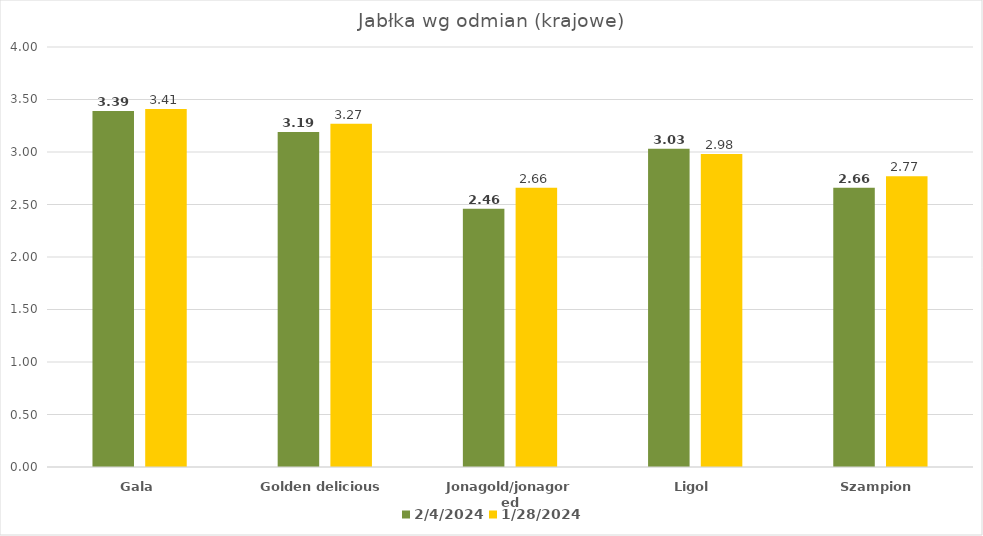
| Category | 04.02.2024 | 28.01.2024 |
|---|---|---|
| Gala | 3.39 | 3.41 |
| Golden delicious | 3.19 | 3.27 |
| Jonagold/jonagored | 2.46 | 2.66 |
| Ligol | 3.03 | 2.98 |
| Szampion | 2.66 | 2.77 |